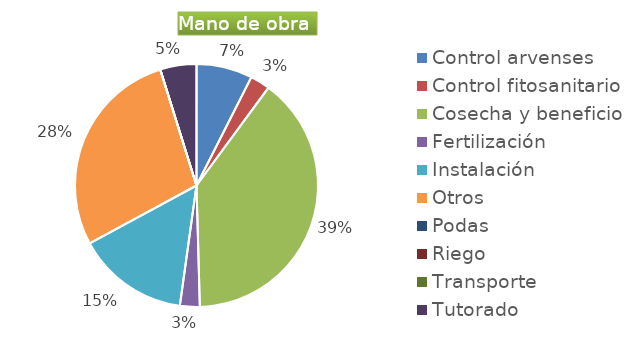
| Category | Series 0 |
|---|---|
| Control arvenses | 595000 |
| Control fitosanitario | 210000 |
| Cosecha y beneficio | 3150000 |
| Fertilización | 210000 |
| Instalación | 1190000 |
| Otros | 2240000 |
| Podas | 0 |
| Riego | 0 |
| Transporte | 0 |
| Tutorado | 385000 |